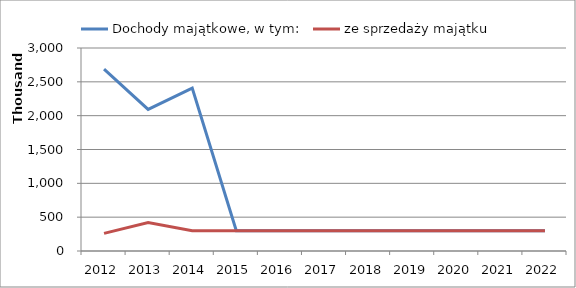
| Category | Dochody majątkowe, w tym: | ze sprzedaży majątku |
|---|---|---|
| 2012.0 | 2687994 | 260000 |
| 2013.0 | 2093000 | 422000 |
| 2014.0 | 2408000 | 300000 |
| 2015.0 | 300000 | 300000 |
| 2016.0 | 300000 | 300000 |
| 2017.0 | 300000 | 300000 |
| 2018.0 | 300000 | 300000 |
| 2019.0 | 300000 | 300000 |
| 2020.0 | 300000 | 300000 |
| 2021.0 | 300000 | 300000 |
| 2022.0 | 300000 | 300000 |